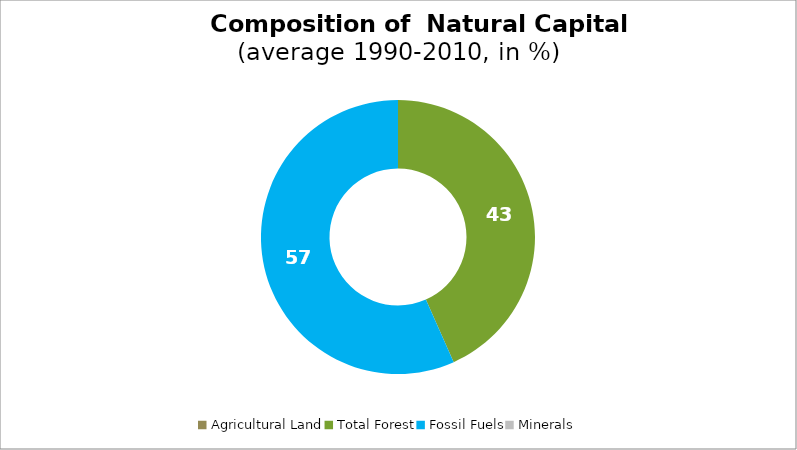
| Category | Series 0 |
|---|---|
| Agricultural Land | 0 |
| Total Forest | 43.335 |
| Fossil Fuels | 56.665 |
| Minerals | 0 |